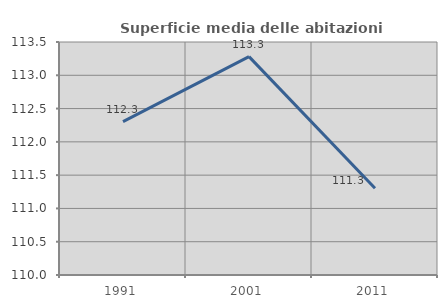
| Category | Superficie media delle abitazioni occupate |
|---|---|
| 1991.0 | 112.305 |
| 2001.0 | 113.28 |
| 2011.0 | 111.303 |